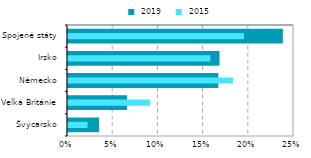
| Category |  2019 |
|---|---|
| Švýcarsko | 0.034 |
| Velká Británie | 0.065 |
| Německo | 0.166 |
| Irsko | 0.168 |
| Spojené státy | 0.238 |